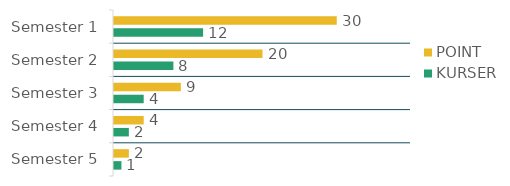
| Category | POINT | KURSER |
|---|---|---|
| Semester 1 | 30 | 12 |
| Semester 2 | 20 | 8 |
| Semester 3 | 9 | 4 |
| Semester 4 | 4 | 2 |
| Semester 5 | 2 | 1 |